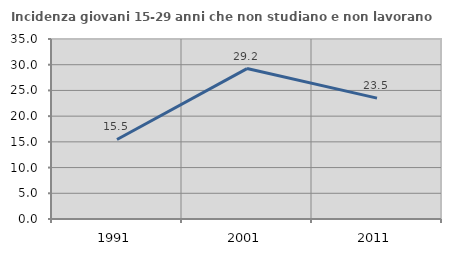
| Category | Incidenza giovani 15-29 anni che non studiano e non lavorano  |
|---|---|
| 1991.0 | 15.46 |
| 2001.0 | 29.25 |
| 2011.0 | 23.498 |